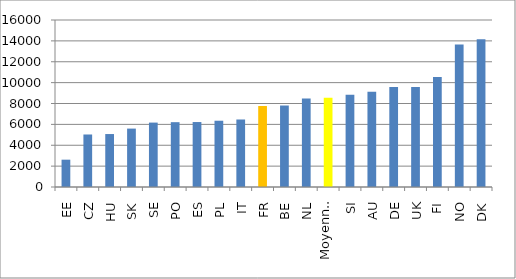
| Category | EAAG 2017 (données 2014) |
|---|---|
| EE | 2618 |
| CZ | 5031 |
| HU | 5074 |
| SK | 5596 |
| SE | 6171 |
| PO | 6211 |
| ES | 6224 |
| PL | 6349 |
| IT | 6468 |
| FR | 7758 |
| BE | 7807 |
| NL | 8482 |
| Moyenne UE22 | 8551 |
| SI | 8839 |
| AU | 9122 |
| DE | 9569 |
| UK | 9586 |
| FI | 10546 |
| NO | 13650 |
| DK | 14148 |